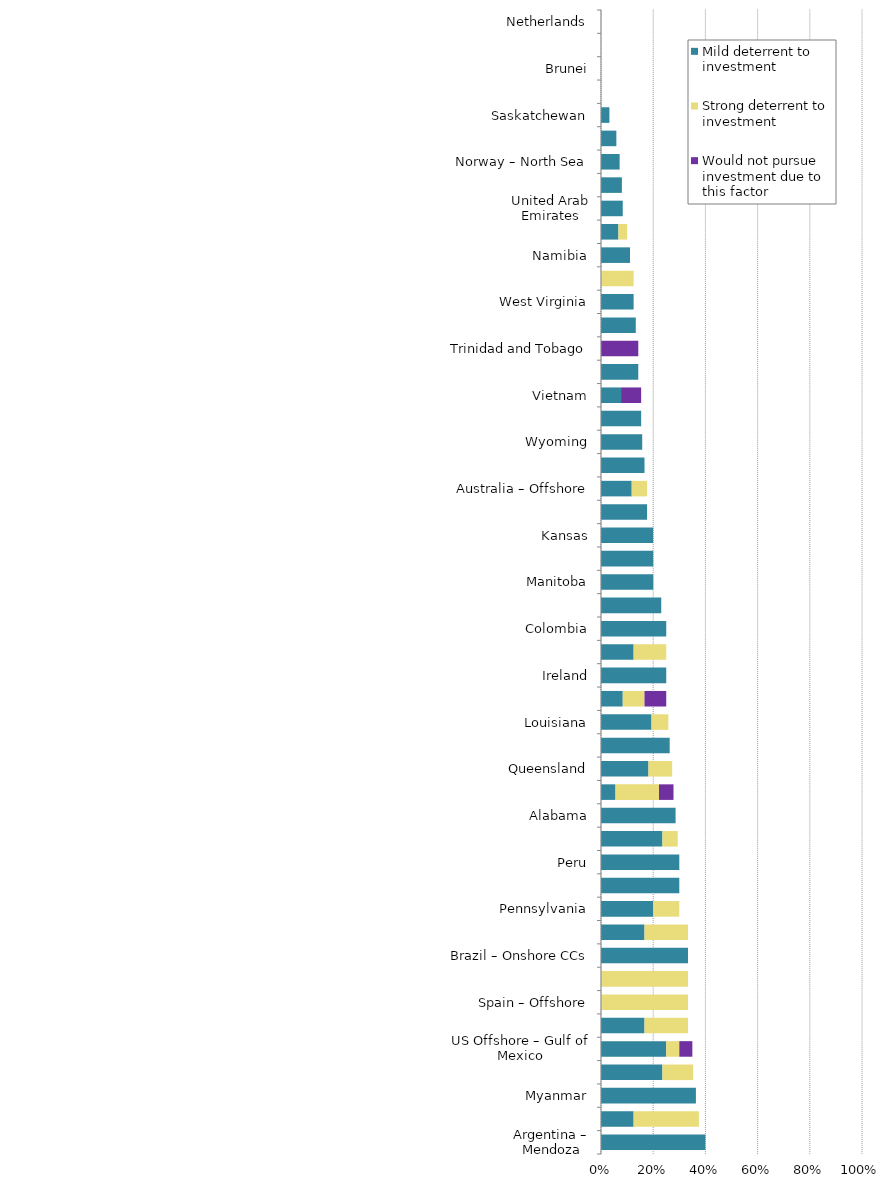
| Category | Mild deterrent to investment | Strong deterrent to investment | Would not pursue investment due to this factor |
|---|---|---|---|
| Argentina – Mendoza | 0.4 | 0 | 0 |
| Kazakhstan | 0.125 | 0.25 | 0 |
| Myanmar | 0.364 | 0 | 0 |
| Thailand | 0.235 | 0.118 | 0 |
| US Offshore – Gulf of Mexico | 0.25 | 0.05 | 0.05 |
| Nova Scotia | 0.167 | 0.167 | 0 |
| Spain – Offshore | 0 | 0.333 | 0 |
| Morocco | 0 | 0.333 | 0 |
| Brazil – Onshore CCs | 0.333 | 0 | 0 |
| Suriname | 0.167 | 0.167 | 0 |
| Pennsylvania | 0.2 | 0.1 | 0 |
| Argentina – Neuquen | 0.3 | 0 | 0 |
| Peru | 0.3 | 0 | 0 |
| Montana | 0.235 | 0.059 | 0 |
| Alabama | 0.286 | 0 | 0 |
| New Mexico | 0.056 | 0.167 | 0.056 |
| Queensland | 0.182 | 0.091 | 0 |
| Western Australia | 0.263 | 0 | 0 |
| Louisiana | 0.194 | 0.065 | 0 |
| Alaska | 0.083 | 0.083 | 0.083 |
| Ireland | 0.25 | 0 | 0 |
| China | 0.125 | 0.125 | 0 |
| Colombia | 0.25 | 0 | 0 |
| Malaysia | 0.231 | 0 | 0 |
| Manitoba | 0.2 | 0 | 0 |
| Arkansas | 0.2 | 0 | 0 |
| Kansas | 0.2 | 0 | 0 |
| South Australia | 0.176 | 0 | 0 |
| Australia – Offshore | 0.118 | 0.059 | 0 |
| Norway – Other Offshore (ex. Nth. Sea) | 0.167 | 0 | 0 |
| Wyoming | 0.158 | 0 | 0 |
| Mississippi | 0.154 | 0 | 0 |
| Vietnam | 0.077 | 0 | 0.077 |
| Oman | 0.143 | 0 | 0 |
| Trinidad and Tobago | 0 | 0 | 0.143 |
| United Kingdom – North Sea | 0.133 | 0 | 0 |
| West Virginia | 0.125 | 0 | 0 |
| UK – Other Offshore (ex. Nth. Sea) | 0 | 0.125 | 0 |
| Namibia | 0.111 | 0 | 0 |
| Oklahoma | 0.067 | 0.033 | 0 |
| United Arab Emirates | 0.083 | 0 | 0 |
| North Dakota | 0.08 | 0 | 0 |
| Norway – North Sea | 0.071 | 0 | 0 |
| Texas | 0.059 | 0 | 0 |
| Saskatchewan | 0.032 | 0 | 0 |
| Newfoundland & Labrador | 0 | 0 | 0 |
| Brunei | 0 | 0 | 0 |
| New Zealand | 0 | 0 | 0 |
| Netherlands | 0 | 0 | 0 |